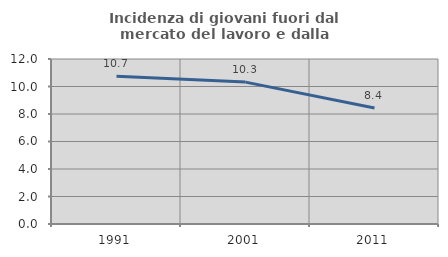
| Category | Incidenza di giovani fuori dal mercato del lavoro e dalla formazione  |
|---|---|
| 1991.0 | 10.743 |
| 2001.0 | 10.319 |
| 2011.0 | 8.435 |